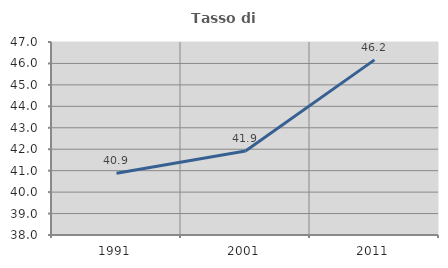
| Category | Tasso di occupazione   |
|---|---|
| 1991.0 | 40.88 |
| 2001.0 | 41.921 |
| 2011.0 | 46.167 |